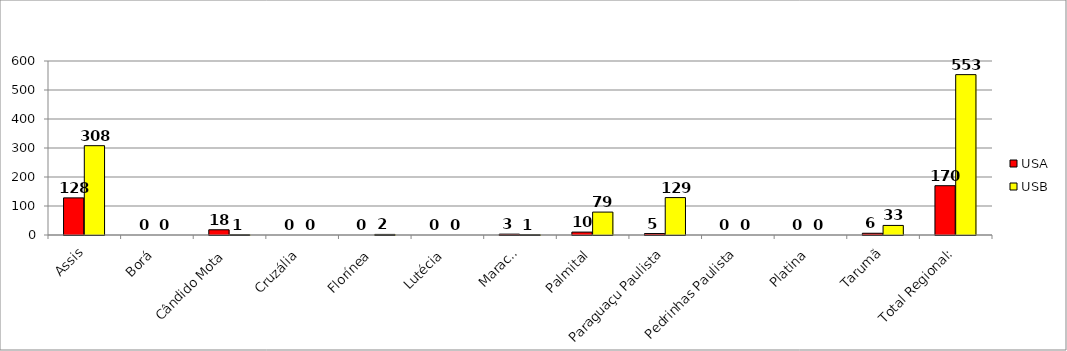
| Category | USA | USB |
|---|---|---|
| Assis | 128 | 308 |
| Borá | 0 | 0 |
| Cândido Mota | 18 | 1 |
| Cruzália | 0 | 0 |
| Florínea | 0 | 2 |
| Lutécia | 0 | 0 |
| Maracaí | 3 | 1 |
| Palmital | 10 | 79 |
| Paraguaçu Paulista | 5 | 129 |
| Pedrinhas Paulista | 0 | 0 |
| Platina | 0 | 0 |
| Tarumã | 6 | 33 |
| Total Regional: | 170 | 553 |